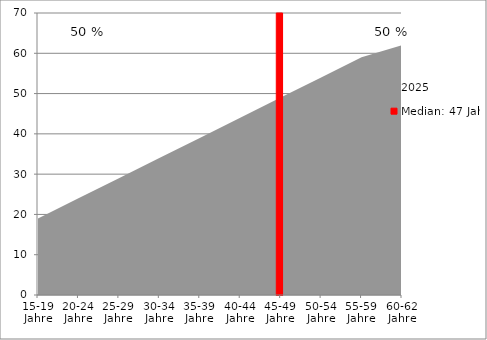
| Category | Median: 47 Jahre |
|---|---|
| 0 | 0 |
| 1 | 0 |
| 2 | 0 |
| 3 | 0 |
| 4 | 0 |
| 5 | 0 |
| 6 | 47 |
| 7 | 0 |
| 8 | 0 |
| 9 | 0 |